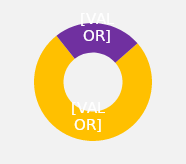
| Category | Series 0 |
|---|---|
| 0 | 0.758 |
| 1 | 0.242 |